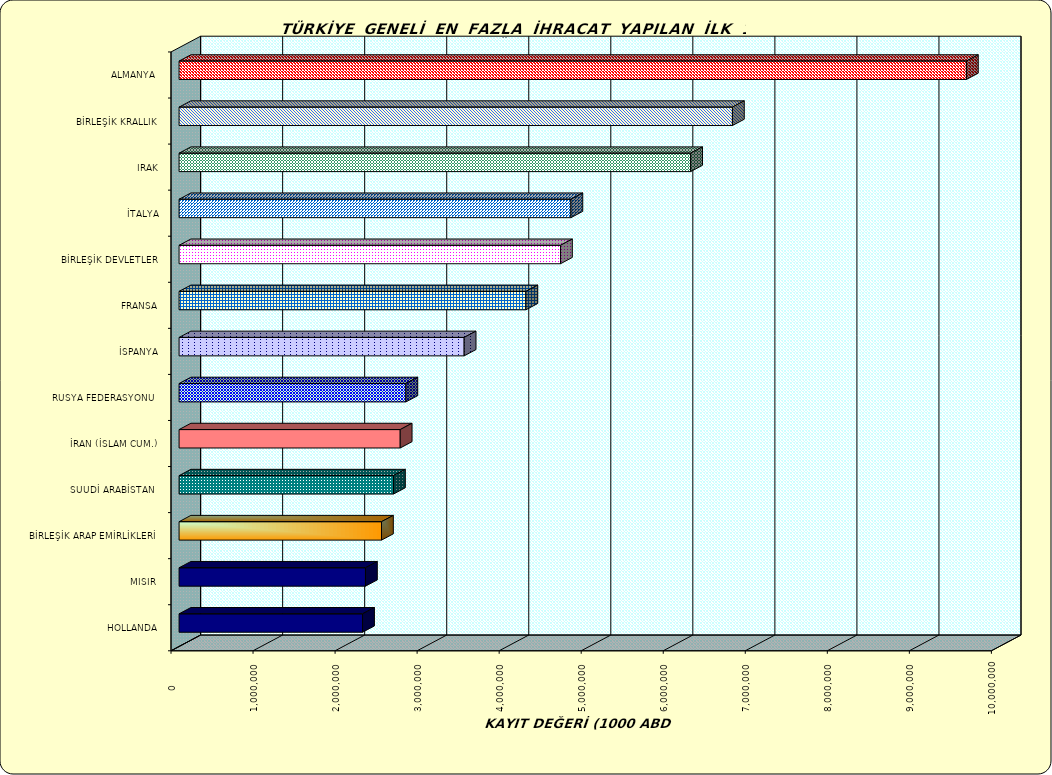
| Category | Series 0 |
|---|---|
| ALMANYA  | 9596849.337 |
| BİRLEŞİK KRALLIK | 6744938.27 |
| IRAK | 6235741.13 |
| İTALYA | 4775941.694 |
| BİRLEŞİK DEVLETLER | 4649269.664 |
| FRANSA | 4227528.198 |
| İSPANYA | 3474853.491 |
| RUSYA FEDERASYONU  | 2764644.657 |
| İRAN (İSLAM CUM.) | 2695369.902 |
| SUUDİ ARABİSTAN  | 2613547.733 |
| BİRLEŞİK ARAP EMİRLİKLERİ | 2467272.564 |
| MISIR  | 2272120.95 |
| HOLLANDA | 2236629.32 |